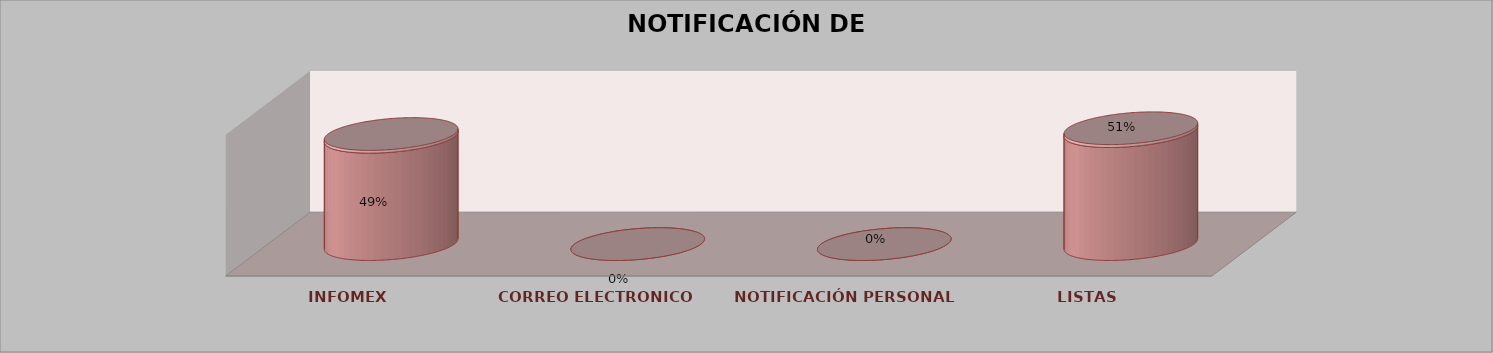
| Category | Series 0 | Series 1 | Series 2 | Series 3 | Series 4 |
|---|---|---|---|---|---|
| INFOMEX |  |  |  | 19 | 0.487 |
| CORREO ELECTRONICO |  |  |  | 0 | 0 |
| NOTIFICACIÓN PERSONAL |  |  |  | 0 | 0 |
| LISTAS |  |  |  | 20 | 0.513 |